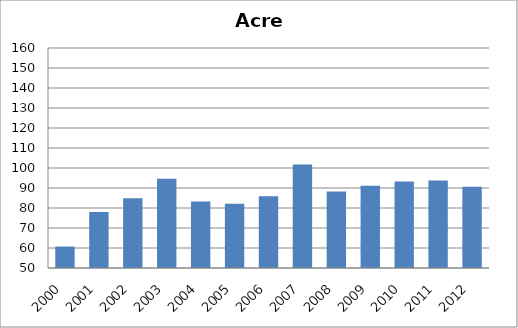
| Category | Hepatite B |
|---|---|
| 2000.0 | 60.72 |
| 2001.0 | 77.99 |
| 2002.0 | 84.91 |
| 2003.0 | 94.58 |
| 2004.0 | 83.24 |
| 2005.0 | 82.15 |
| 2006.0 | 85.93 |
| 2007.0 | 101.72 |
| 2008.0 | 88.3 |
| 2009.0 | 91.18 |
| 2010.0 | 93.29 |
| 2011.0 | 93.78 |
| 2012.0 | 90.68 |